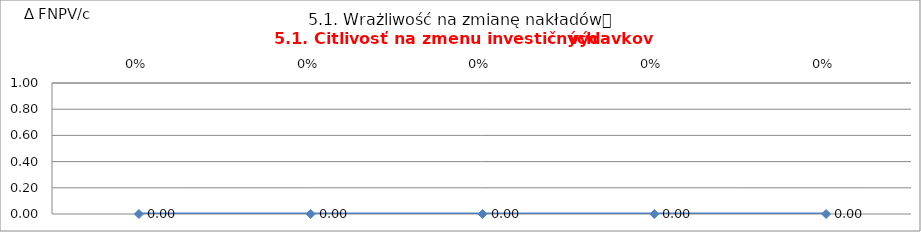
| Category | 6.1. Wrażliwość na zmianę nakładów
6.1. Citlivosť na zmenu investičných výdavkov |
|---|---|
| 0.0 | 0 |
| 0.0 | 0 |
| 0.0 | 0 |
| 0.0 | 0 |
| 0.0 | 0 |